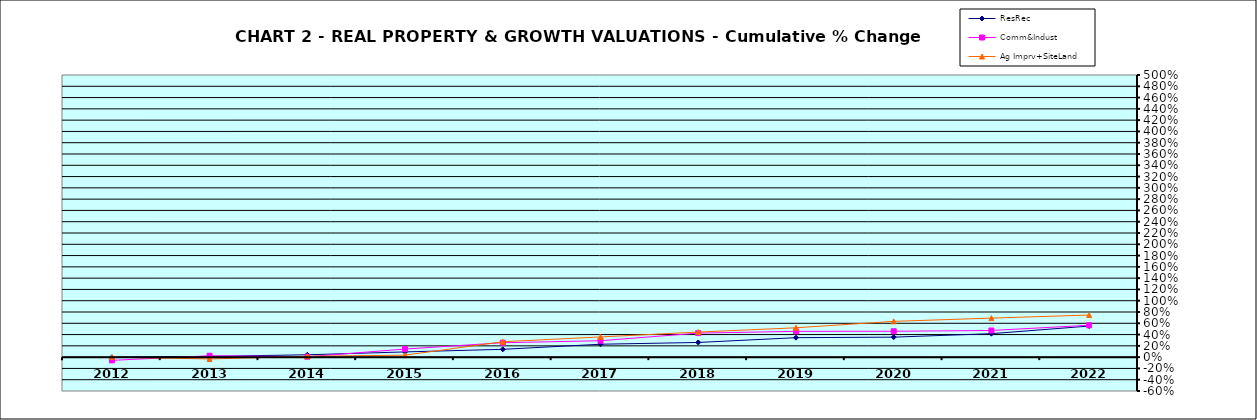
| Category | ResRec | Comm&Indust | Ag Imprv+SiteLand |
|---|---|---|---|
| 2012.0 | -0.004 | -0.057 | 0 |
| 2013.0 | 0.013 | 0.025 | -0.032 |
| 2014.0 | 0.042 | 0.007 | 0.016 |
| 2015.0 | 0.093 | 0.143 | 0.035 |
| 2016.0 | 0.139 | 0.255 | 0.273 |
| 2017.0 | 0.229 | 0.291 | 0.358 |
| 2018.0 | 0.26 | 0.426 | 0.444 |
| 2019.0 | 0.345 | 0.457 | 0.52 |
| 2020.0 | 0.354 | 0.458 | 0.634 |
| 2021.0 | 0.416 | 0.473 | 0.692 |
| 2022.0 | 0.551 | 0.565 | 0.746 |